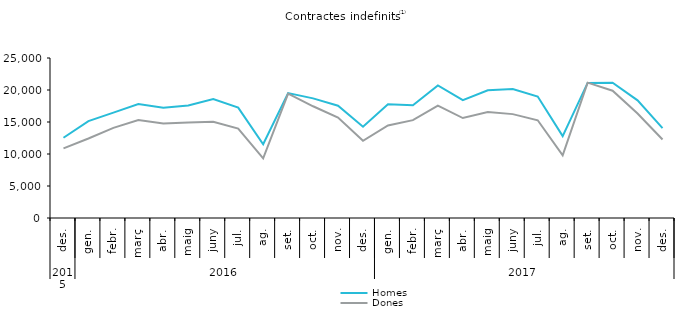
| Category | Homes | Dones |
|---|---|---|
| 0 | 12544 | 10877 |
| 1 | 15139 | 12421 |
| 2 | 16470 | 14080 |
| 3 | 17798 | 15312 |
| 4 | 17236 | 14774 |
| 5 | 17579 | 14912 |
| 6 | 18578 | 15022 |
| 7 | 17244 | 13970 |
| 8 | 11521 | 9309 |
| 9 | 19525 | 19446 |
| 10 | 18694 | 17458 |
| 11 | 17541 | 15692 |
| 12 | 14259 | 12054 |
| 13 | 17764 | 14459 |
| 14 | 17627 | 15287 |
| 15 | 20725 | 17561 |
| 16 | 18415 | 15619 |
| 17 | 19962 | 16575 |
| 18 | 20163 | 16230 |
| 19 | 18985 | 15270 |
| 20 | 12791 | 9790 |
| 21 | 21106 | 21150 |
| 22 | 21146 | 19892 |
| 23 | 18387 | 16334 |
| 24 | 14042 | 12259 |